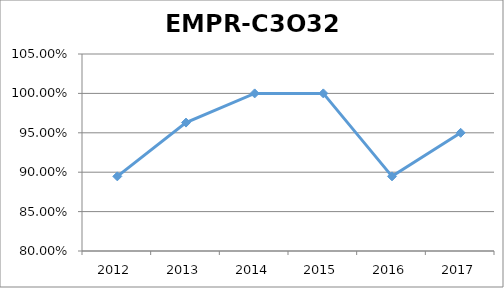
| Category | EMPR-C3O32 |
|---|---|
| 2012.0 | 0.895 |
| 2013.0 | 0.963 |
| 2014.0 | 1 |
| 2015.0 | 1 |
| 2016.0 | 0.895 |
| 2017.0 | 0.95 |